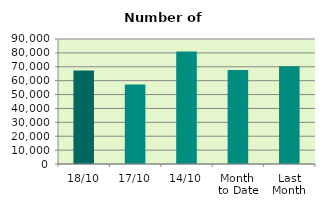
| Category | Series 0 |
|---|---|
| 18/10 | 67346 |
| 17/10 | 57266 |
| 14/10 | 81080 |
| Month 
to Date | 67727.833 |
| Last
Month | 70459.909 |